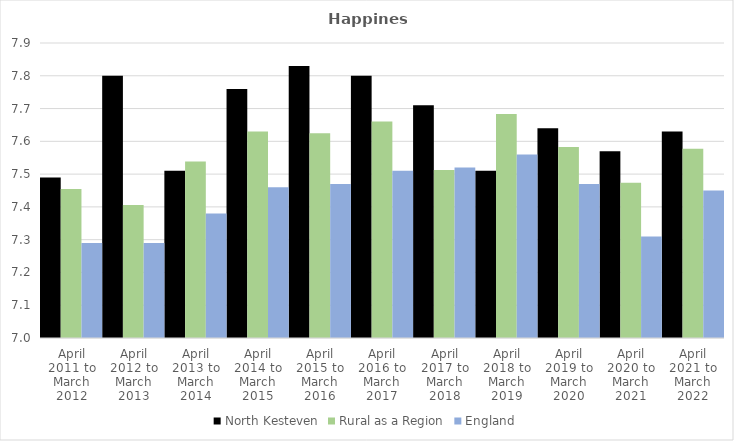
| Category | North Kesteven | Rural as a Region | England |
|---|---|---|---|
| April 2011 to March 2012 | 7.49 | 7.454 | 7.29 |
| April 2012 to March 2013 | 7.8 | 7.406 | 7.29 |
| April 2013 to March 2014 | 7.51 | 7.539 | 7.38 |
| April 2014 to March 2015 | 7.76 | 7.63 | 7.46 |
| April 2015 to March 2016 | 7.83 | 7.625 | 7.47 |
| April 2016 to March 2017 | 7.8 | 7.661 | 7.51 |
| April 2017 to March 2018 | 7.71 | 7.513 | 7.52 |
| April 2018 to March 2019 | 7.51 | 7.684 | 7.56 |
| April 2019 to March 2020 | 7.64 | 7.582 | 7.47 |
| April 2020 to March 2021 | 7.57 | 7.474 | 7.31 |
| April 2021 to March 2022 | 7.63 | 7.577 | 7.45 |